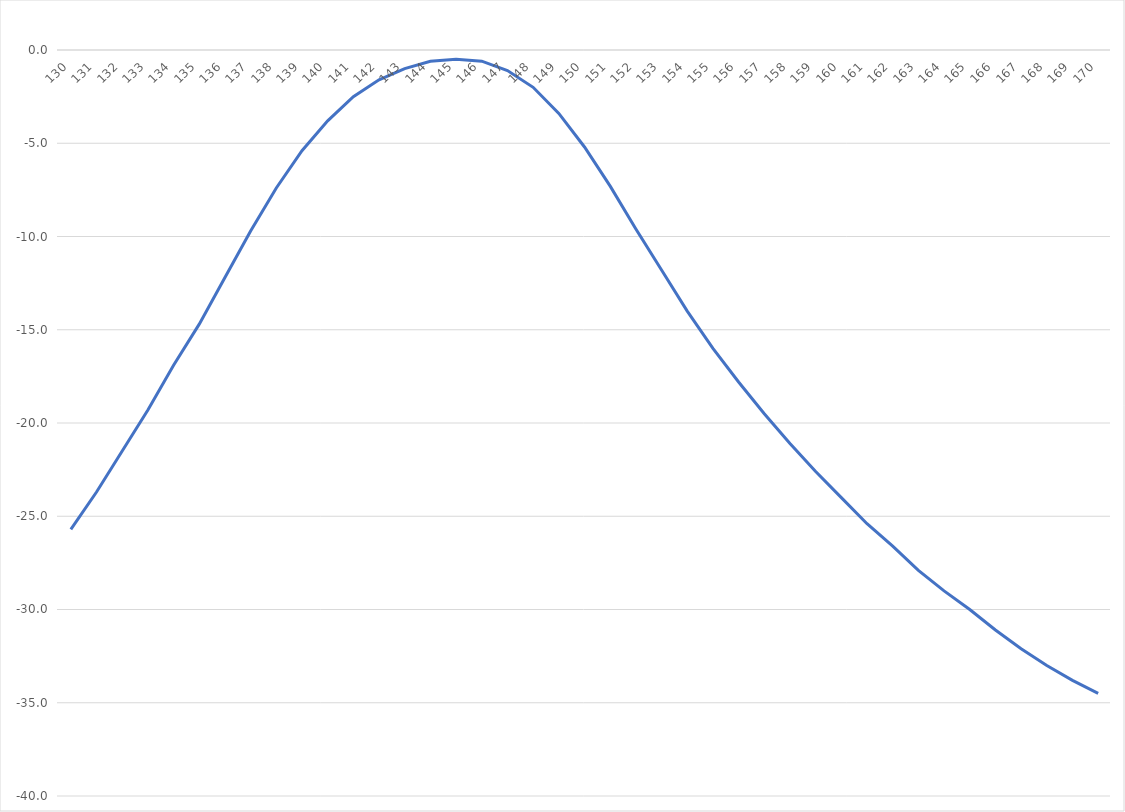
| Category | Series 0 |
|---|---|
| 130.0 | -25.7 |
| 131.0 | -23.7 |
| 132.0 | -21.5 |
| 133.0 | -19.3 |
| 134.0 | -16.9 |
| 135.0 | -14.7 |
| 136.0 | -12.2 |
| 137.0 | -9.7 |
| 138.0 | -7.4 |
| 139.0 | -5.4 |
| 140.0 | -3.8 |
| 141.0 | -2.5 |
| 142.0 | -1.6 |
| 143.0 | -1 |
| 144.0 | -0.6 |
| 145.0 | -0.5 |
| 146.0 | -0.6 |
| 147.0 | -1.1 |
| 148.0 | -2 |
| 149.0 | -3.4 |
| 150.0 | -5.2 |
| 151.0 | -7.3 |
| 152.0 | -9.6 |
| 153.0 | -11.8 |
| 154.0 | -14 |
| 155.0 | -16 |
| 156.0 | -17.8 |
| 157.0 | -19.5 |
| 158.0 | -21.1 |
| 159.0 | -22.6 |
| 160.0 | -24 |
| 161.0 | -25.4 |
| 162.0 | -26.6 |
| 163.0 | -27.9 |
| 164.0 | -29 |
| 165.0 | -30 |
| 166.0 | -31.1 |
| 167.0 | -32.1 |
| 168.0 | -33 |
| 169.0 | -33.8 |
| 170.0 | -34.5 |